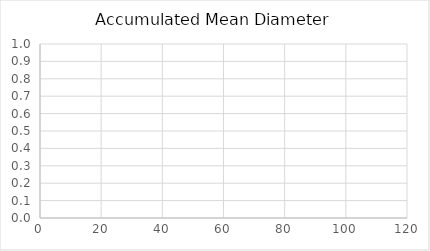
| Category | Accumulated Mean Diameter |
|---|---|
| 3.0 | 0 |
| 4.0 | 0 |
| 5.0 | 0 |
| 6.0 | 0 |
| 7.0 | 0 |
| 8.0 | 0 |
| 9.0 | 0 |
| 10.0 | 0 |
| 11.0 | 0 |
| 12.0 | 0 |
| 13.0 | 0 |
| 14.0 | 0 |
| 15.0 | 0 |
| 16.0 | 0 |
| 17.0 | 0 |
| 18.0 | 0 |
| 19.0 | 0 |
| 20.0 | 0 |
| 21.0 | 0 |
| 22.0 | 0 |
| 23.0 | 0 |
| 24.0 | 0 |
| 25.0 | 0 |
| 26.0 | 0 |
| 27.0 | 0 |
| 28.0 | 0 |
| 29.0 | 0 |
| 30.0 | 0 |
| 31.0 | 0 |
| 32.0 | 0 |
| 33.0 | 0 |
| 34.0 | 0 |
| 35.0 | 0 |
| 36.0 | 0 |
| 37.0 | 0 |
| 38.0 | 0 |
| 39.0 | 0 |
| 40.0 | 0 |
| 41.0 | 0 |
| 42.0 | 0 |
| 43.0 | 0 |
| 44.0 | 0 |
| 45.0 | 0 |
| 46.0 | 0 |
| 47.0 | 0 |
| 48.0 | 0 |
| 49.0 | 0 |
| 50.0 | 0 |
| 51.0 | 0 |
| 52.0 | 0 |
| 53.0 | 0 |
| 54.0 | 0 |
| 55.0 | 0 |
| 56.0 | 0 |
| 57.0 | 0 |
| 58.0 | 0 |
| 59.0 | 0 |
| 60.0 | 0 |
| 61.0 | 0 |
| 62.0 | 0 |
| 63.0 | 0 |
| 64.0 | 0 |
| 65.0 | 0 |
| 66.0 | 0 |
| 67.0 | 0 |
| 68.0 | 0 |
| 69.0 | 0 |
| 70.0 | 0 |
| 71.0 | 0 |
| 72.0 | 0 |
| 73.0 | 0 |
| 74.0 | 0 |
| 75.0 | 0 |
| 76.0 | 0 |
| 77.0 | 0 |
| 78.0 | 0 |
| 79.0 | 0 |
| 80.0 | 0 |
| 81.0 | 0 |
| 82.0 | 0 |
| 83.0 | 0 |
| 84.0 | 0 |
| 85.0 | 0 |
| 86.0 | 0 |
| 87.0 | 0 |
| 88.0 | 0 |
| 89.0 | 0 |
| 90.0 | 0 |
| 91.0 | 0 |
| 92.0 | 0 |
| 93.0 | 0 |
| 94.0 | 0 |
| 95.0 | 0 |
| 96.0 | 0 |
| 97.0 | 0 |
| 98.0 | 0 |
| 99.0 | 0 |
| 100.0 | 0 |